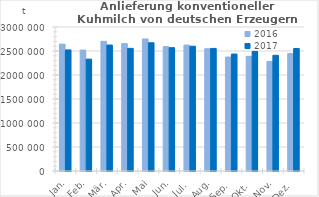
| Category | 2016 | 2017 |
|---|---|---|
| Jan. | 2642627.686 | 2523078.708 |
| Feb. | 2519270.419 | 2330371.304 |
| Mär. | 2701081.098 | 2624246.113 |
| Apr. | 2654137.99 | 2555146.12 |
| Mai | 2750858.71 | 2671585.814 |
| Jun. | 2591178.371 | 2569110.989 |
| Jul. | 2623442.078 | 2599442.785 |
| Aug. | 2547127.298 | 2553555.765 |
| Sep. | 2374230.044 | 2436926.228 |
| Okt. | 2388805.801 | 2490419.964 |
| Nov. | 2281993.372 | 2410350.894 |
| Dez. | 2448498.07 | 2551810.371 |